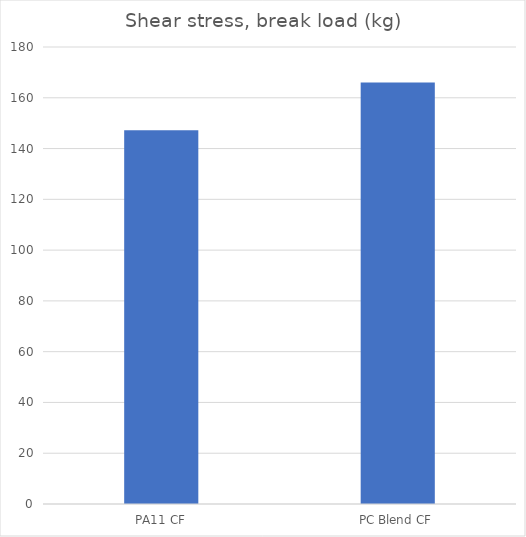
| Category | Break kg |
|---|---|
| PA11 CF | 147.2 |
| PC Blend CF | 166 |